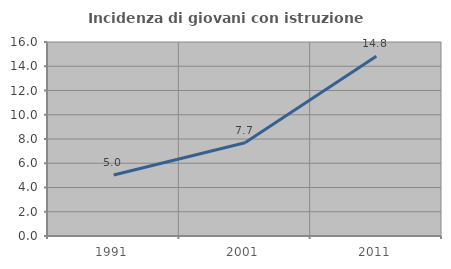
| Category | Incidenza di giovani con istruzione universitaria |
|---|---|
| 1991.0 | 5.037 |
| 2001.0 | 7.692 |
| 2011.0 | 14.826 |